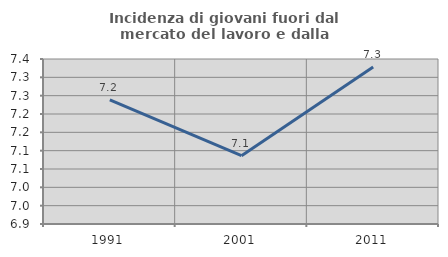
| Category | Incidenza di giovani fuori dal mercato del lavoro e dalla formazione  |
|---|---|
| 1991.0 | 7.238 |
| 2001.0 | 7.086 |
| 2011.0 | 7.328 |